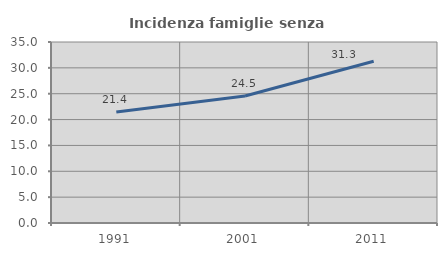
| Category | Incidenza famiglie senza nuclei |
|---|---|
| 1991.0 | 21.45 |
| 2001.0 | 24.545 |
| 2011.0 | 31.273 |